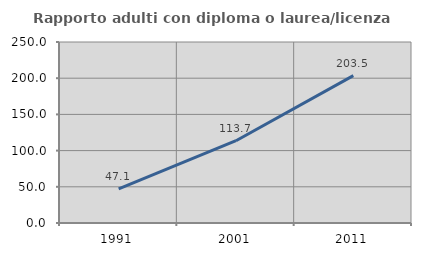
| Category | Rapporto adulti con diploma o laurea/licenza media  |
|---|---|
| 1991.0 | 47.083 |
| 2001.0 | 113.655 |
| 2011.0 | 203.54 |